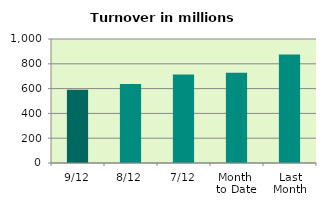
| Category | Series 0 |
|---|---|
| 9/12 | 590.973 |
| 8/12 | 637.885 |
| 7/12 | 712.896 |
| Month 
to Date | 726.974 |
| Last
Month | 874.327 |